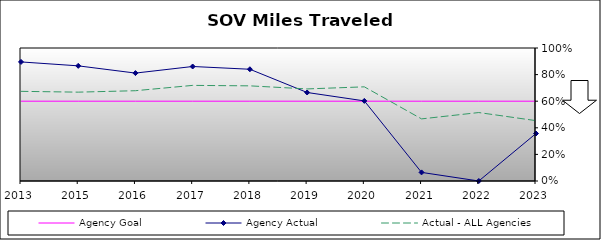
| Category | Agency Goal | Agency Actual | Actual - ALL Agencies |
|---|---|---|---|
| 2013.0 | 0.6 | 0.895 | 0.674 |
| 2015.0 | 0.6 | 0.866 | 0.668 |
| 2016.0 | 0.6 | 0.811 | 0.679 |
| 2017.0 | 0.6 | 0.861 | 0.719 |
| 2018.0 | 0.6 | 0.84 | 0.715 |
| 2019.0 | 0.6 | 0.666 | 0.692 |
| 2020.0 | 0.6 | 0.602 | 0.708 |
| 2021.0 | 0.6 | 0.065 | 0.467 |
| 2022.0 | 0.6 | 0 | 0.515 |
| 2023.0 | 0.6 | 0.357 | 0.454 |